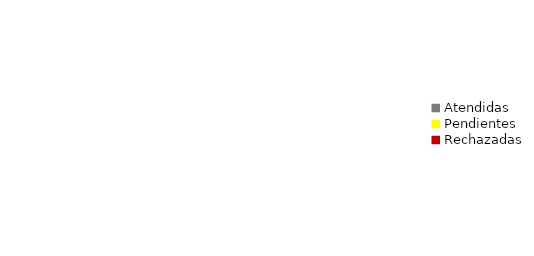
| Category | 0 |
|---|---|
| Atendidas | 0 |
| Pendientes  | 0 |
| Rechazadas | 0 |